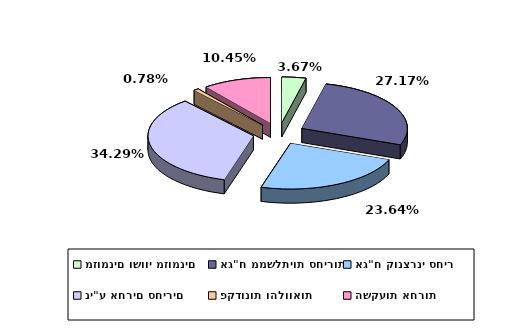
| Category | Series 0 |
|---|---|
| מזומנים ושווי מזומנים | 0.037 |
| אג"ח ממשלתיות סחירות | 0.272 |
| אג"ח קונצרני סחיר | 0.236 |
| ני"ע אחרים סחירים | 0.343 |
| פקדונות והלוואות | 0.008 |
| השקעות אחרות | 0.104 |